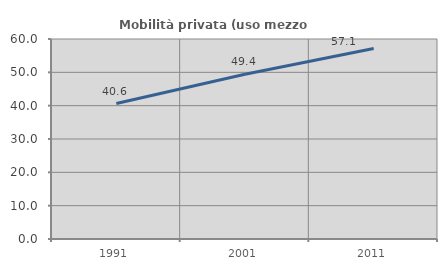
| Category | Mobilità privata (uso mezzo privato) |
|---|---|
| 1991.0 | 40.645 |
| 2001.0 | 49.432 |
| 2011.0 | 57.143 |